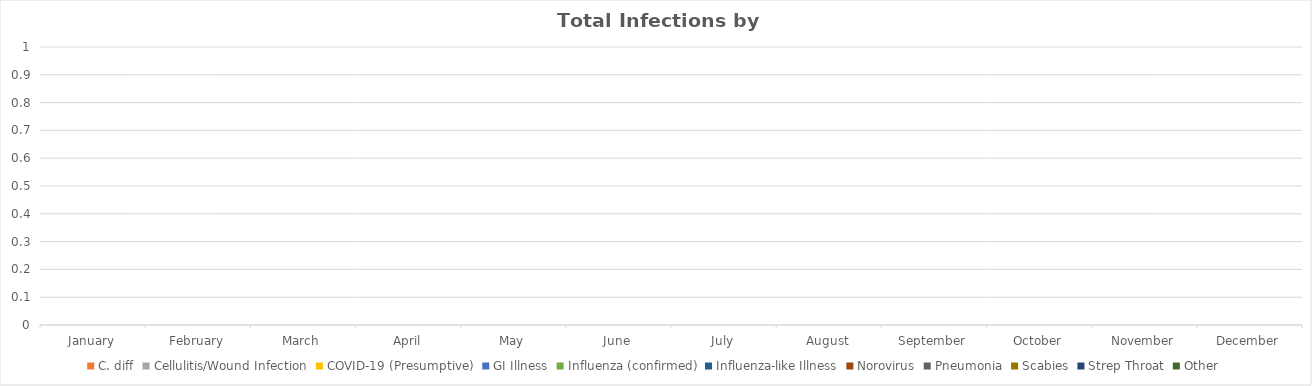
| Category | C. diff | Cellulitis/Wound Infection | COVID-19 (Presumptive) | GI Illness | Influenza (confirmed) | Influenza-like Illness | Norovirus | Pneumonia | Scabies | Strep Throat | Other |
|---|---|---|---|---|---|---|---|---|---|---|---|
| January | 0 | 0 | 0 | 0 | 0 | 0 | 0 | 0 | 0 | 0 | 0 |
| February | 0 | 0 | 0 | 0 | 0 | 0 | 0 | 0 | 0 | 0 | 0 |
| March | 0 | 0 | 0 | 0 | 0 | 0 | 0 | 0 | 0 | 0 | 0 |
| April | 0 | 0 | 0 | 0 | 0 | 0 | 0 | 0 | 0 | 0 | 0 |
| May | 0 | 0 | 0 | 0 | 0 | 0 | 0 | 0 | 0 | 0 | 0 |
| June | 0 | 0 | 0 | 0 | 0 | 0 | 0 | 0 | 0 | 0 | 0 |
| July | 0 | 0 | 0 | 0 | 0 | 0 | 0 | 0 | 0 | 0 | 0 |
| August | 0 | 0 | 0 | 0 | 0 | 0 | 0 | 0 | 0 | 0 | 0 |
| September | 0 | 0 | 0 | 0 | 0 | 0 | 0 | 0 | 0 | 0 | 0 |
| October | 0 | 0 | 0 | 0 | 0 | 0 | 0 | 0 | 0 | 0 | 0 |
| November | 0 | 0 | 0 | 0 | 0 | 0 | 0 | 0 | 0 | 0 | 0 |
| December | 0 | 0 | 0 | 0 | 0 | 0 | 0 | 0 | 0 | 0 | 0 |